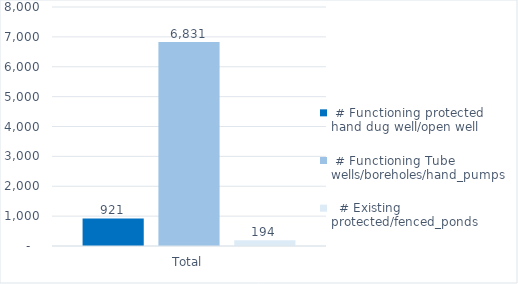
| Category |  # Functioning protected hand dug well/open well |  # Functioning Tube wells/boreholes/hand_pumps |   # Existing protected/fenced_ponds |
|---|---|---|---|
| Total | 921 | 6831 | 194 |